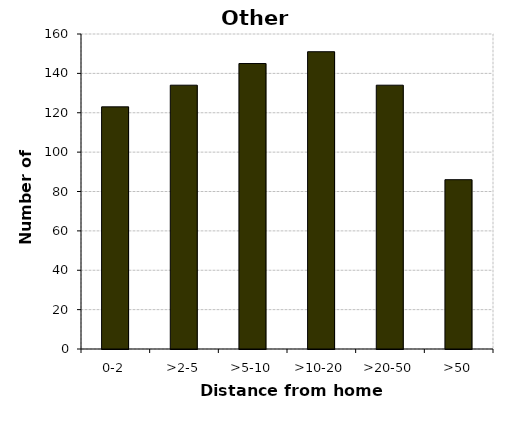
| Category | Other vehicles |
|---|---|
| 0-2 | 123 |
| >2-5 | 134 |
| >5-10 | 145 |
| >10-20 | 151 |
| >20-50 | 134 |
| >50 | 86 |